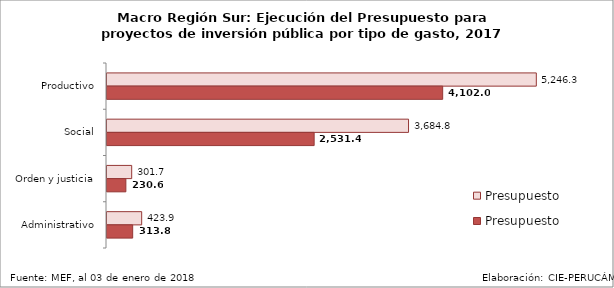
| Category | Presupuesto | Presupuesto Ejecutado |
|---|---|---|
| Productivo | 5246.264 | 4101.997 |
| Social | 3684.794 | 2531.407 |
| Orden y justicia | 301.713 | 230.597 |
| Administrativo | 423.879 | 313.762 |